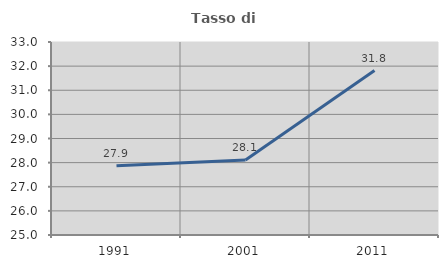
| Category | Tasso di occupazione   |
|---|---|
| 1991.0 | 27.875 |
| 2001.0 | 28.113 |
| 2011.0 | 31.818 |